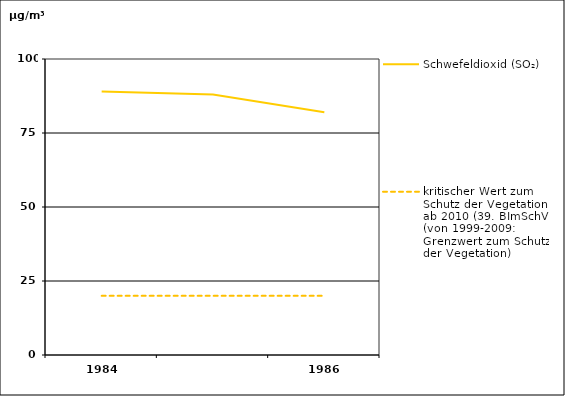
| Category | Schwefeldioxid (SO₂) | kritischer Wert zum Schutz der Vegetation ab 2010 (39. BImSchV) (von 1999-2009: Grenzwert zum Schutz der Vegetation) |
|---|---|---|
| 1984.0 | 89 | 20 |
| 1985.0 | 88 | 20 |
| 1986.0 | 82 | 20 |